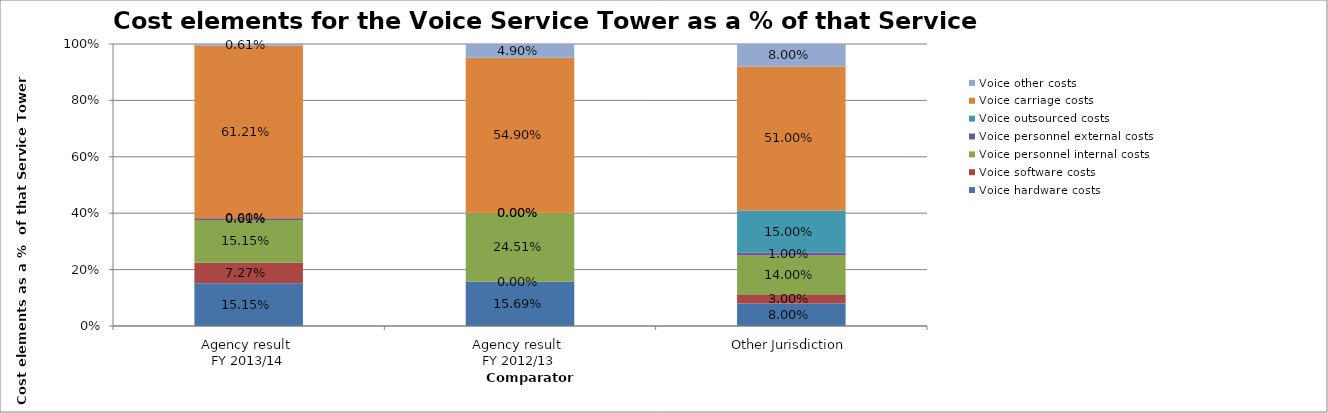
| Category | Voice hardware costs | Voice software costs | Voice personnel internal costs | Voice personnel external costs | Voice outsourced costs | Voice carriage costs | Voice other costs |
|---|---|---|---|---|---|---|---|
| Agency result 
FY 2013/14 | 0.152 | 0.073 | 0.152 | 0.006 | 0 | 0.612 | 0.006 |
| Agency result 
FY 2012/13 | 0.157 | 0 | 0.245 | 0 | 0 | 0.549 | 0.049 |
| Other Jurisdiction | 0.08 | 0.03 | 0.14 | 0.01 | 0.15 | 0.51 | 0.08 |